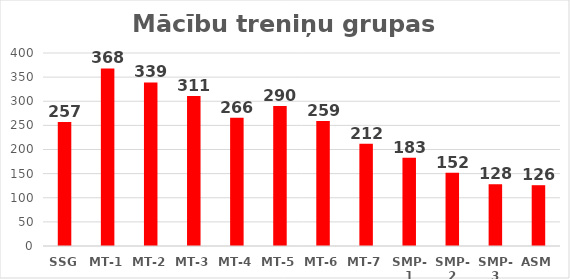
| Category | Grupas |
|---|---|
| SSG | 257 |
| MT-1 | 368 |
| MT-2 | 339 |
| MT-3 | 311 |
| MT-4 | 266 |
| MT-5 | 290 |
| MT-6 | 259 |
| MT-7 | 212 |
| SMP-1 | 183 |
| SMP-2 | 152 |
| SMP-3 | 128 |
| ASM | 126 |